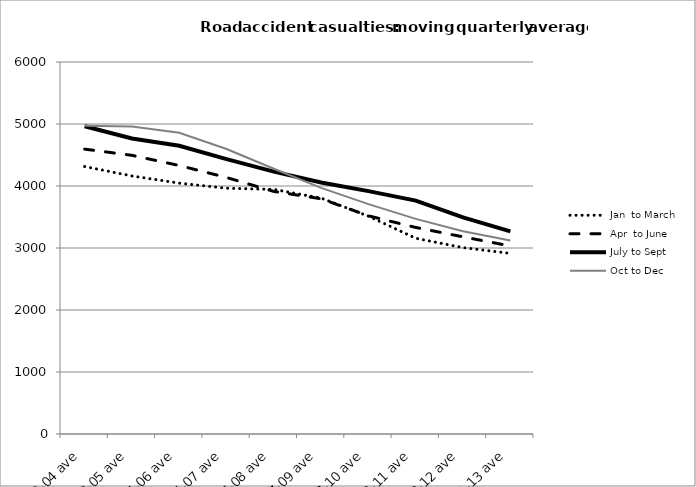
| Category | Jan  to March | Apr  to June | July to Sept | Oct to Dec |
|---|---|---|---|---|
| 2002-04 ave | 4314 | 4594.667 | 4963 | 4972.667 |
| 2003-05 ave | 4161.667 | 4494.667 | 4766 | 4958.667 |
| 2004-06 ave | 4046 | 4330.667 | 4648.667 | 4860 |
| 2005-07 ave | 3963.667 | 4137 | 4433 | 4597.333 |
| 2006-08 ave | 3945 | 3912.333 | 4231.667 | 4277.667 |
| 2007-09 ave | 3804.667 | 3793.667 | 4056.333 | 3970 |
| 2008-10 ave | 3512.667 | 3519 | 3917.667 | 3708.333 |
| 2009-11 ave | 3157 | 3331.333 | 3765 | 3469.667 |
| 2010-12 ave | 3005.667 | 3180 | 3494 | 3269.333 |
| 2011-13 ave | 2913 | 3032.333 | 3269 | 3121.333 |